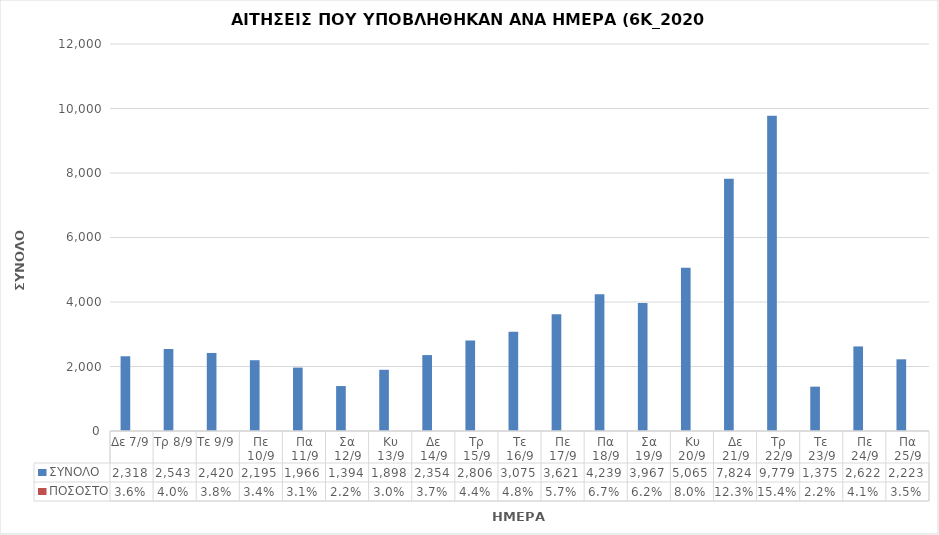
| Category | ΣΥΝΟΛΟ | ΠΟΣΟΣΤΟ |
|---|---|---|
| Δε 7/9 | 2318 | 0.036 |
| Τρ 8/9 | 2543 | 0.04 |
| Τε 9/9 | 2420 | 0.038 |
| Πε 10/9 | 2195 | 0.034 |
| Πα 11/9 | 1966 | 0.031 |
| Σα 12/9 | 1394 | 0.022 |
| Κυ 13/9 | 1898 | 0.03 |
| Δε 14/9 | 2354 | 0.037 |
| Τρ 15/9 | 2806 | 0.044 |
| Τε 16/9 | 3075 | 0.048 |
| Πε 17/9 | 3621 | 0.057 |
| Πα 18/9 | 4239 | 0.067 |
| Σα 19/9 | 3967 | 0.062 |
| Κυ 20/9 | 5065 | 0.08 |
| Δε 21/9 | 7824 | 0.123 |
| Τρ 22/9 | 9779 | 0.154 |
| Τε 23/9 | 1375 | 0.022 |
| Πε 24/9 | 2622 | 0.041 |
| Πα 25/9 | 2223 | 0.035 |